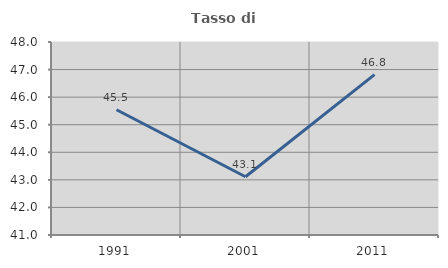
| Category | Tasso di occupazione   |
|---|---|
| 1991.0 | 45.543 |
| 2001.0 | 43.113 |
| 2011.0 | 46.816 |